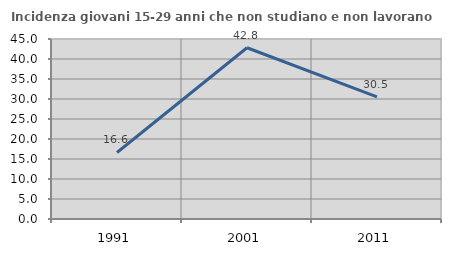
| Category | Incidenza giovani 15-29 anni che non studiano e non lavorano  |
|---|---|
| 1991.0 | 16.63 |
| 2001.0 | 42.816 |
| 2011.0 | 30.548 |